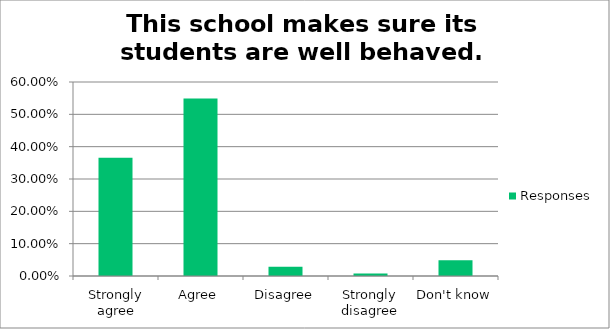
| Category | Responses |
|---|---|
| Strongly agree | 0.366 |
| Agree | 0.549 |
| Disagree | 0.028 |
| Strongly disagree | 0.008 |
| Don't know | 0.049 |